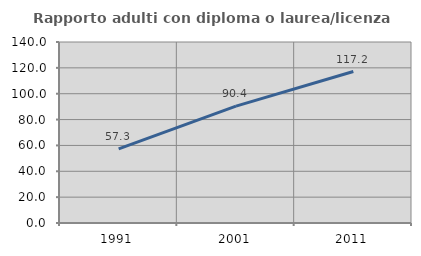
| Category | Rapporto adulti con diploma o laurea/licenza media  |
|---|---|
| 1991.0 | 57.322 |
| 2001.0 | 90.357 |
| 2011.0 | 117.162 |